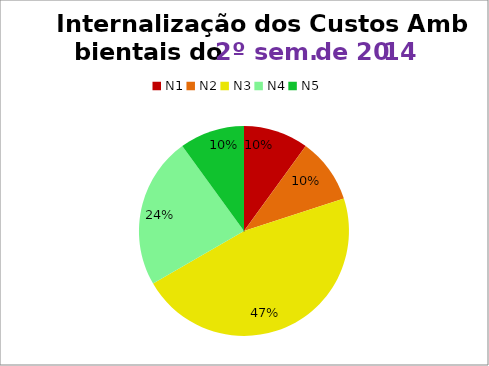
| Category | 2º/14 |
|---|---|
| N1 | 3 |
| N2 | 3 |
| N3 | 14 |
| N4 | 7 |
| N5 | 3 |